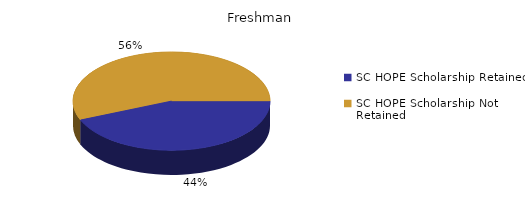
| Category | Freshman |
|---|---|
| SC HOPE Scholarship Retained  | 191 |
| SC HOPE Scholarship Not Retained  | 246 |